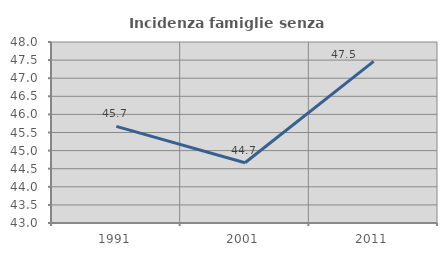
| Category | Incidenza famiglie senza nuclei |
|---|---|
| 1991.0 | 45.669 |
| 2001.0 | 44.664 |
| 2011.0 | 47.464 |